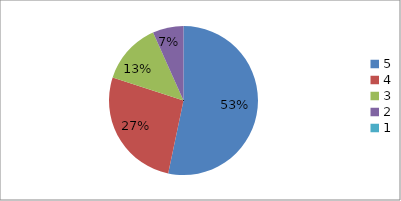
| Category | Series 0 | Series 1 |
|---|---|---|
| 5.0 | 53.3 | 53.3 |
| 4.0 | 26.7 | 26.7 |
| 3.0 | 13.3 | 13.3 |
| 2.0 | 6.7 | 6.7 |
| 1.0 | 0 | 0 |